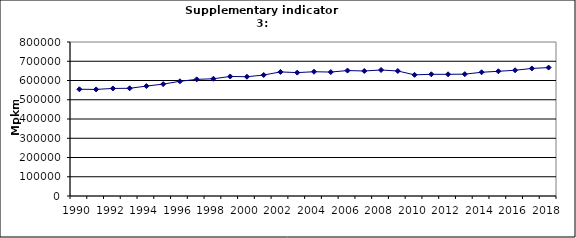
| Category | Passenger transport by cars, Mpkm |
|---|---|
| 1990 | 554446.844 |
| 1991 | 553715.364 |
| 1992 | 558844.084 |
| 1993 | 559476.779 |
| 1994 | 571018.077 |
| 1995 | 581231.361 |
| 1996 | 595924.825 |
| 1997 | 605941.938 |
| 1998 | 609086.786 |
| 1999 | 620975.331 |
| 2000 | 619612.492 |
| 2001 | 628462.659 |
| 2002 | 644507.265 |
| 2003 | 641031.601 |
| 2004 | 645483.143 |
| 2005 | 643838.571 |
| 2006 | 651672.785 |
| 2007 | 649397.603 |
| 2008 | 654532.433 |
| 2009 | 649381.954 |
| 2010 | 629402.621 |
| 2011 | 632220.569 |
| 2012 | 632176.927 |
| 2013 | 632945.146 |
| 2014 | 642795.578 |
| 2015 | 647849.234 |
| 2016 | 653182.442 |
| 2017 | 662585.282 |
| 2018 | 667057.795 |